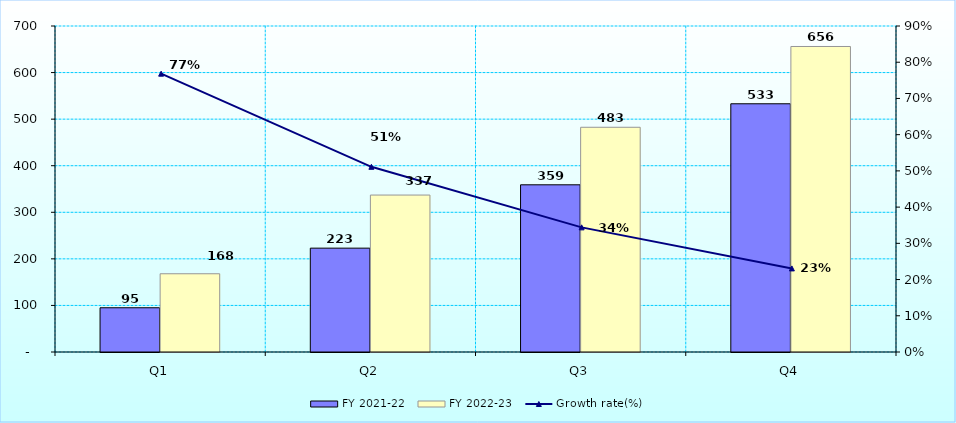
| Category | FY 2021-22 | FY 2022-23 |
|---|---|---|
| Q1 | 95 | 168 |
| Q2 | 223 | 337 |
| Q3 | 359 | 482.528 |
| Q4 | 533 | 656 |